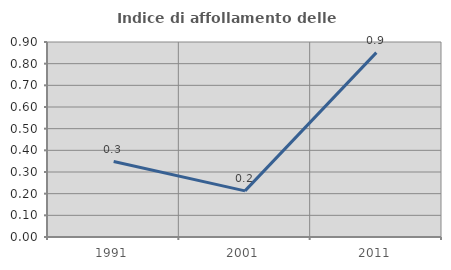
| Category | Indice di affollamento delle abitazioni  |
|---|---|
| 1991.0 | 0.348 |
| 2001.0 | 0.213 |
| 2011.0 | 0.851 |